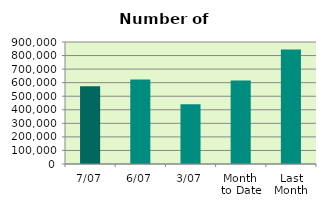
| Category | Series 0 |
|---|---|
| 7/07 | 574130 |
| 6/07 | 623668 |
| 3/07 | 441680 |
| Month 
to Date | 615681.2 |
| Last
Month | 844726.818 |